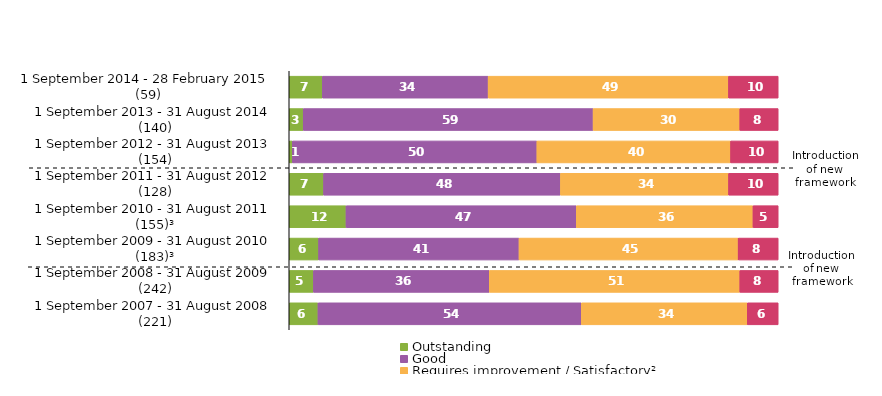
| Category | Outstanding | Good | Requires improvement / Satisfactory² | Inadequate |
|---|---|---|---|---|
| 1 September 2014 - 28 February 2015 (59) | 6.78 | 33.898 | 49.153 | 10.169 |
| 1 September 2013 - 31 August 2014 (140) | 2.857 | 59.286 | 30 | 7.857 |
| 1 September 2012 - 31 August 2013 (154) | 0.649 | 50 | 39.61 | 9.74 |
| 1 September 2011 - 31 August 2012 (128) | 7.031 | 48.438 | 34.375 | 10.156 |
| 1 September 2010 - 31 August 2011 (155)³ | 11.613 | 47.097 | 36.129 | 5.161 |
| 1 September 2009 - 31 August 2010 (183)³ | 6.011 | 40.984 | 44.809 | 8.197 |
| 1 September 2008 - 31 August 2009 (242) | 4.959 | 35.95 | 51.24 | 7.851 |
| 1 September 2007 - 31 August 2008 (221) | 5.882 | 53.846 | 33.937 | 6.335 |